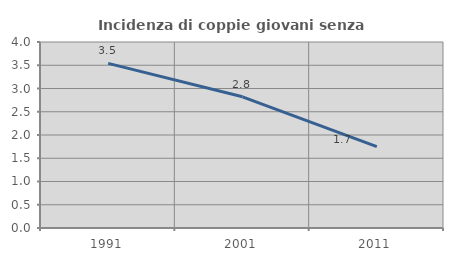
| Category | Incidenza di coppie giovani senza figli |
|---|---|
| 1991.0 | 3.54 |
| 2001.0 | 2.822 |
| 2011.0 | 1.748 |